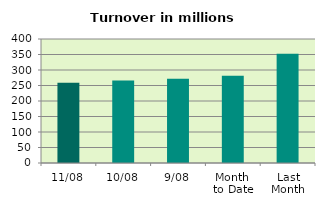
| Category | Series 0 |
|---|---|
| 11/08 | 258.672 |
| 10/08 | 266.147 |
| 9/08 | 271.915 |
| Month 
to Date | 281.462 |
| Last
Month | 352.063 |